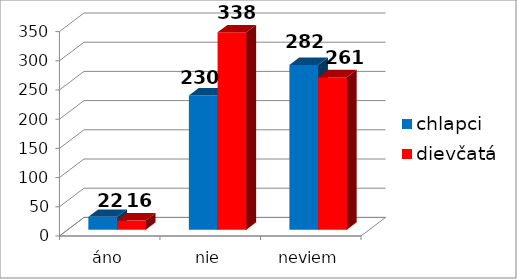
| Category | chlapci | dievčatá |
|---|---|---|
| áno | 22 | 16 |
| nie | 230 | 338 |
| neviem | 282 | 261 |